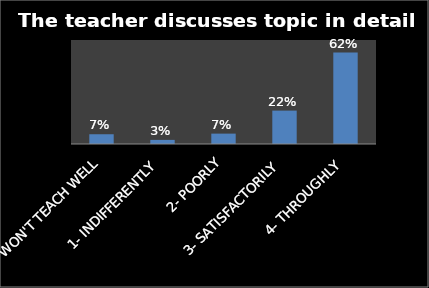
| Category | Series 0 |
|---|---|
| 0- WON'T TEACH WELL | 0.066 |
| 1- INDIFFERENTLY | 0.028 |
| 2- POORLY | 0.07 |
| 3- SATISFACTORILY | 0.225 |
| 4- THROUGHLY | 0.615 |